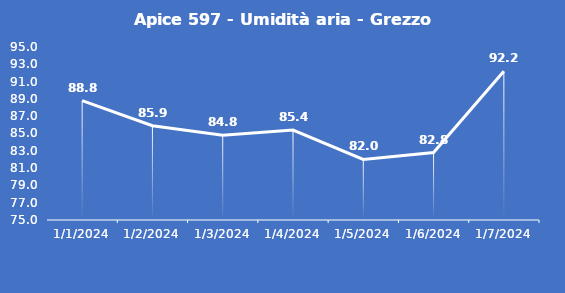
| Category | Apice 597 - Umidità aria - Grezzo (%) |
|---|---|
| 1/1/24 | 88.8 |
| 1/2/24 | 85.9 |
| 1/3/24 | 84.8 |
| 1/4/24 | 85.4 |
| 1/5/24 | 82 |
| 1/6/24 | 82.8 |
| 1/7/24 | 92.2 |